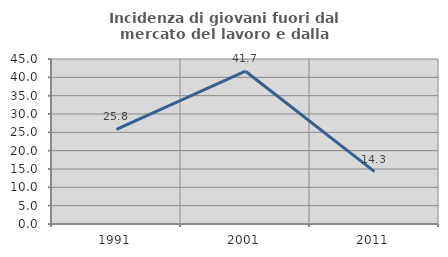
| Category | Incidenza di giovani fuori dal mercato del lavoro e dalla formazione  |
|---|---|
| 1991.0 | 25.806 |
| 2001.0 | 41.667 |
| 2011.0 | 14.286 |